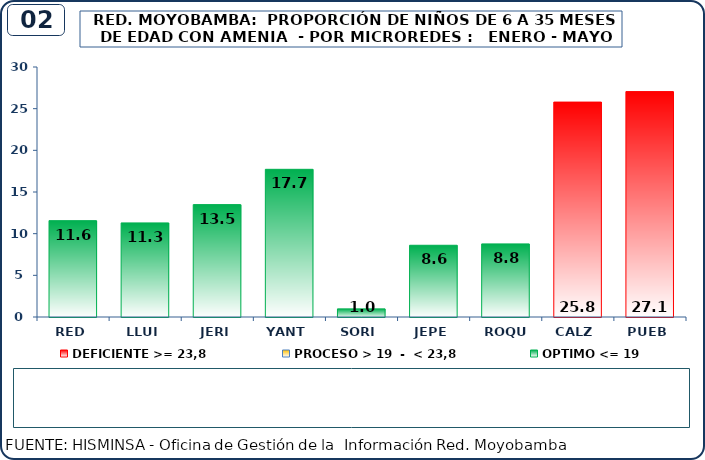
| Category | DEFICIENTE >= 23,8 | PROCESO > 19  -  < 23,8 | OPTIMO <= 19 |
|---|---|---|---|
| RED | 0 | 0 | 11.567 |
| LLUI | 0 | 0 | 11.29 |
| JERI | 0 | 0 | 13.492 |
| YANT | 0 | 0 | 17.722 |
| SORI | 0 | 0 | 0.979 |
| JEPE | 0 | 0 | 8.607 |
| ROQU | 0 | 0 | 8.772 |
| CALZ | 25.789 | 0 | 0 |
| PUEB | 27.053 | 0 | 0 |